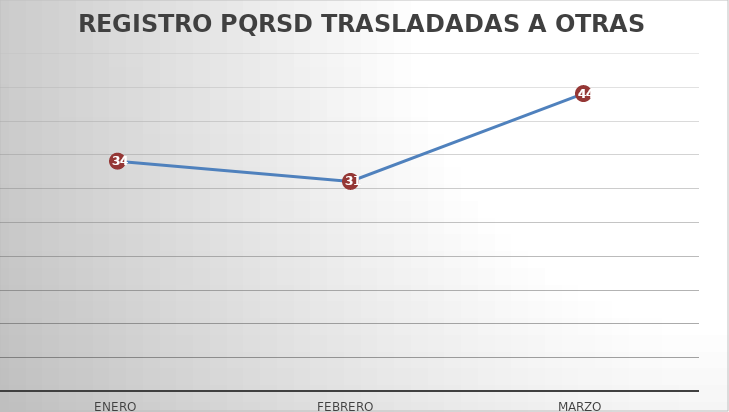
| Category | Series 0 |
|---|---|
| ENERO | 34 |
| FEBRERO  | 31 |
| MARZO | 44 |